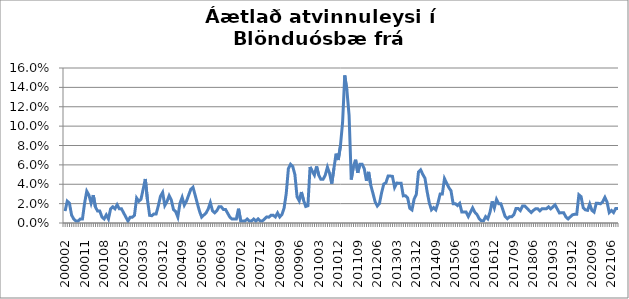
| Category | Series 0 |
|---|---|
| 200002 | 0.012 |
| 200003 | 0.023 |
| 200004 | 0.02 |
| 200005 | 0.008 |
| 200006 | 0.004 |
| 200007 | 0.002 |
| 200008 | 0.002 |
| 200009 | 0.004 |
| 200010 | 0.004 |
| 200011 | 0.02 |
| 200012 | 0.033 |
| 200101 | 0.029 |
| 200102 | 0.021 |
| 200103 | 0.029 |
| 200104 | 0.016 |
| 200105 | 0.012 |
| 200106 | 0.012 |
| 200107 | 0.006 |
| 200108 | 0.004 |
| 200109 | 0.008 |
| 200110 | 0.004 |
| 200111 | 0.015 |
| 200112 | 0.017 |
| 200201 | 0.015 |
| 200202 | 0.019 |
| 200203 | 0.015 |
| 200204 | 0.015 |
| 200205 | 0.01 |
| 200206 | 0.006 |
| 200208 | 0.002 |
| 200209 | 0.006 |
| 200210 | 0.006 |
| 200211 | 0.008 |
| 200212 | 0.026 |
| 200301 | 0.022 |
| 200302 | 0.024 |
| 200303 | 0.035 |
| 200304 | 0.045 |
| 200305 | 0.024 |
| 200306 | 0.008 |
| 200307 | 0.008 |
| 200308 | 0.009 |
| 200309 | 0.009 |
| 200310 | 0.018 |
| 200311 | 0.028 |
| 200312 | 0.032 |
| 200401 | 0.018 |
| 200402 | 0.022 |
| 200403 | 0.028 |
| 200404 | 0.024 |
| 200405 | 0.014 |
| 200406 | 0.012 |
| 200407 | 0.006 |
| 200408 | 0.02 |
| 200409 | 0.026 |
| 200410 | 0.018 |
| 200411 | 0.023 |
| 200412 | 0.029 |
| 200501 | 0.035 |
| 200502 | 0.037 |
| 200503 | 0.029 |
| 200504 | 0.02 |
| 200505 | 0.012 |
| 200506 | 0.006 |
| 200507 | 0.008 |
| 200508 | 0.01 |
| 200509 | 0.014 |
| 200510 | 0.021 |
| 200511 | 0.013 |
| 200512 | 0.011 |
| 200601 | 0.013 |
| 200602 | 0.017 |
| 200603 | 0.017 |
| 200604 | 0.014 |
| 200605 | 0.014 |
| 200606 | 0.01 |
| 200607 | 0.006 |
| 200608 | 0.004 |
| 200609 | 0.004 |
| 200612 | 0.004 |
| 200701 | 0.015 |
| 200702 | 0.002 |
| 200703 | 0.002 |
| 200704 | 0.002 |
| 200705 | 0.004 |
| 200706 | 0.002 |
| 200707 | 0.002 |
| 200708 | 0.004 |
| 200709 | 0.002 |
| 200711 | 0.004 |
| 200712 | 0.002 |
| 200801 | 0.002 |
| 200802 | 0.004 |
| 200803 | 0.006 |
| 200804 | 0.006 |
| 200805 | 0.008 |
| 200806 | 0.008 |
| 200807 | 0.006 |
| 200808 | 0.01 |
| 200809 | 0.006 |
| 200810 | 0.009 |
| 200811 | 0.015 |
| 200812 | 0.03 |
| 200901 | 0.056 |
| 200902 | 0.061 |
| 200903 | 0.058 |
| 200904 | 0.05 |
| 200905 | 0.027 |
| 200906 | 0.023 |
| 200907 | 0.032 |
| 200908 | 0.023 |
| 200909 | 0.017 |
| 200910 | 0.018 |
| 200911 | 0.058 |
| 200912 | 0.053 |
| 201001 | 0.049 |
| 201002 | 0.058 |
| 201003 | 0.049 |
| 201004 | 0.045 |
| 201005 | 0.045 |
| 201006 | 0.049 |
| 201007 | 0.058 |
| 201008 | 0.051 |
| 201009 | 0.041 |
| 201010 | 0.056 |
| 201011 | 0.072 |
| 201012 | 0.065 |
| 201101 | 0.079 |
| 201102 | 0.104 |
| 201103 | 0.152 |
| 201104 | 0.137 |
| 201105 | 0.111 |
| 201106 | 0.045 |
| 201107 | 0.059 |
| 201108 | 0.065 |
| 201109 | 0.052 |
| 201110 | 0.061 |
| 201111 | 0.061 |
| 201112 | 0.056 |
| 201201 | 0.044 |
| 201202 | 0.053 |
| 201203 | 0.039 |
| 201204 | 0.031 |
| 201205 | 0.022 |
| 201206 | 0.018 |
| 201207 | 0.02 |
| 201208 | 0.031 |
| 201209 | 0.04 |
| 201210 | 0.042 |
| 201211 | 0.048 |
| 201212 | 0.048 |
| 201301 | 0.048 |
| 201302 | 0.037 |
| 201303 | 0.041 |
| 201304 | 0.041 |
| 201305 | 0.041 |
| 201306 | 0.028 |
| 201307 | 0.028 |
| 201308 | 0.026 |
| 201309 | 0.015 |
| 201310 | 0.014 |
| 201311 | 0.025 |
| 201312 | 0.029 |
| 201401 | 0.053 |
| 201402 | 0.055 |
| 201403 | 0.05 |
| 201404 | 0.046 |
| 201405 | 0.032 |
| 201406 | 0.021 |
| 201407 | 0.014 |
| 201408 | 0.016 |
| 201409 | 0.014 |
| 201410 | 0.021 |
| 201411 | 0.03 |
| 201412 | 0.03 |
| 201501 | 0.046 |
| 201502 | 0.041 |
| 201503 | 0.037 |
| 201504 | 0.033 |
| 201505 | 0.02 |
| 201506 | 0.02 |
| 201507 | 0.018 |
| 201508 | 0.02 |
| 201509 | 0.011 |
| 201510 | 0.011 |
| 201511 | 0.011 |
| 201512 | 0.007 |
| 201601 | 0.011 |
| 201602 | 0.016 |
| 201603 | 0.011 |
| 201604 | 0.009 |
| 201605 | 0.004 |
| 201606 | 0.002 |
| 201607 | 0.002 |
| 201608 | 0.007 |
| 201609 | 0.004 |
| 201610 | 0.011 |
| 201611 | 0.022 |
| 201612 | 0.016 |
| 201701 | 0.024 |
| 201702 | 0.02 |
| 201703 | 0.02 |
| 201704 | 0.013 |
| 201705 | 0.007 |
| 201706 | 0.004 |
| 201707 | 0.006 |
| 201708 | 0.006 |
| 201709 | 0.009 |
| 201710 | 0.015 |
| 201711 | 0.015 |
| 201712 | 0.013 |
| 201801 | 0.018 |
| 201802 | 0.018 |
| 201803 | 0.015 |
| 201804 | 0.013 |
| 201805 | 0.011 |
| 201806 | 0.013 |
| 201807 | 0.015 |
| 201808 | 0.015 |
| 201809 | 0.013 |
| 201810 | 0.015 |
| 201811 | 0.015 |
| 201812 | 0.015 |
| 201901 | 0.017 |
| 201902 | 0.015 |
| 201903 | 0.017 |
| 201904 | 0.019 |
| 201905 | 0.015 |
| 201906 | 0.01 |
| 201907 | 0.011 |
| 201908 | 0.011 |
| 201909 | 0.006 |
| 201910 | 0.004 |
| 201911 | 0.006 |
| 201912 | 0.008 |
| 202001 | 0.009 |
| 202002 | 0.009 |
| 202003 | 0.029 |
| 202004 | 0.027 |
| 202005 | 0.016 |
| 202006 | 0.014 |
| 202007 | 0.013 |
| 202008 | 0.02 |
| 202009 | 0.013 |
| 202010 | 0.011 |
| 202011 | 0.02 |
| 202012 | 0.02 |
| 202101 | 0.02 |
| 202102 | 0.022 |
| 202103 | 0.026 |
| 202104 | 0.022 |
| 202105 | 0.011 |
| 202106 | 0.013 |
| 202107 | 0.011 |
| 202108 | 0.015 |
| 202109 | 0.015 |